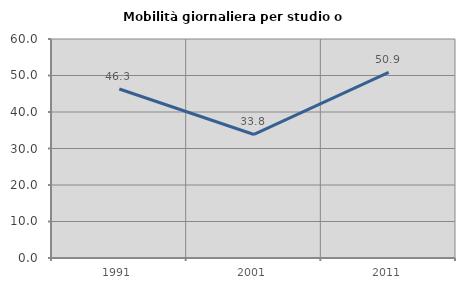
| Category | Mobilità giornaliera per studio o lavoro |
|---|---|
| 1991.0 | 46.296 |
| 2001.0 | 33.846 |
| 2011.0 | 50.854 |